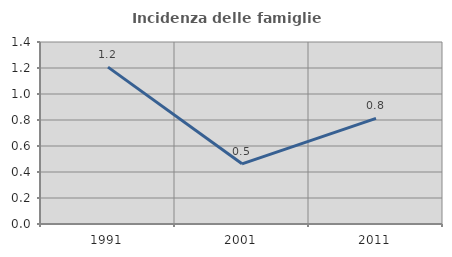
| Category | Incidenza delle famiglie numerose |
|---|---|
| 1991.0 | 1.207 |
| 2001.0 | 0.463 |
| 2011.0 | 0.813 |